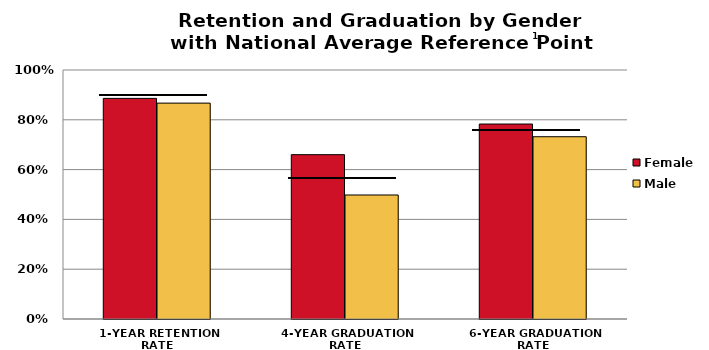
| Category | Female | Male |
|---|---|---|
| 1-YEAR RETENTION RATE | 0.886 | 0.867 |
| 4-YEAR GRADUATION RATE | 0.66 | 0.498 |
| 6-YEAR GRADUATION RATE | 0.783 | 0.732 |